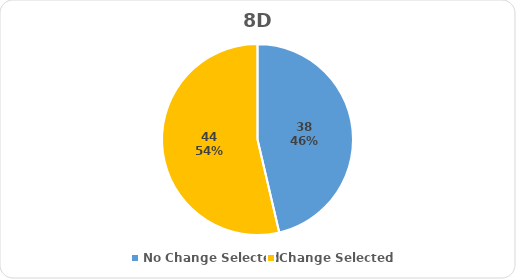
| Category | Series 0 |
|---|---|
| No Change Selected | 38 |
| Change Selected | 44 |